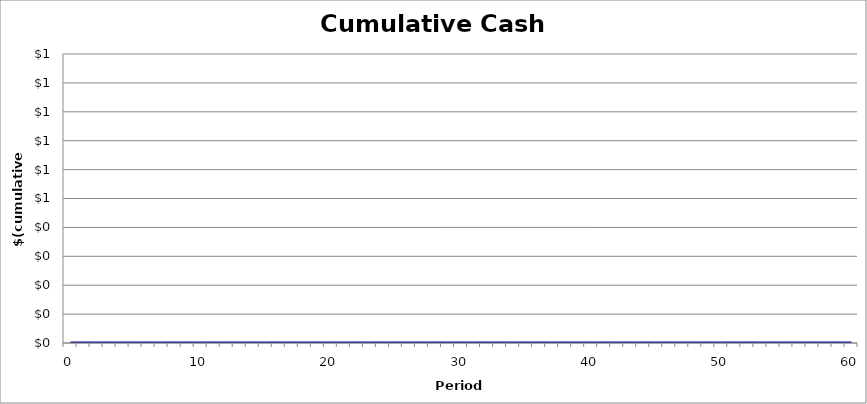
| Category | Cumulative Cash Flows |
|---|---|
| 0.0 | 0 |
| 1.0 | 0 |
| 2.0 | 0 |
| 3.0 | 0 |
| 4.0 | 0 |
| 5.0 | 0 |
| 6.0 | 0 |
| 7.0 | 0 |
| 8.0 | 0 |
| 9.0 | 0 |
| 10.0 | 0 |
| 11.0 | 0 |
| 12.0 | 0 |
| 13.0 | 0 |
| 14.0 | 0 |
| 15.0 | 0 |
| 16.0 | 0 |
| 17.0 | 0 |
| 18.0 | 0 |
| 19.0 | 0 |
| 20.0 | 0 |
| 21.0 | 0 |
| 22.0 | 0 |
| 23.0 | 0 |
| 24.0 | 0 |
| 25.0 | 0 |
| 26.0 | 0 |
| 27.0 | 0 |
| 28.0 | 0 |
| 29.0 | 0 |
| 30.0 | 0 |
| 31.0 | 0 |
| 32.0 | 0 |
| 33.0 | 0 |
| 34.0 | 0 |
| 35.0 | 0 |
| 36.0 | 0 |
| 37.0 | 0 |
| 38.0 | 0 |
| 39.0 | 0 |
| 40.0 | 0 |
| 41.0 | 0 |
| 42.0 | 0 |
| 43.0 | 0 |
| 44.0 | 0 |
| 45.0 | 0 |
| 46.0 | 0 |
| 47.0 | 0 |
| 48.0 | 0 |
| 49.0 | 0 |
| 50.0 | 0 |
| 51.0 | 0 |
| 52.0 | 0 |
| 53.0 | 0 |
| 54.0 | 0 |
| 55.0 | 0 |
| 56.0 | 0 |
| 57.0 | 0 |
| 58.0 | 0 |
| 59.0 | 0 |
| 60.0 | 0 |